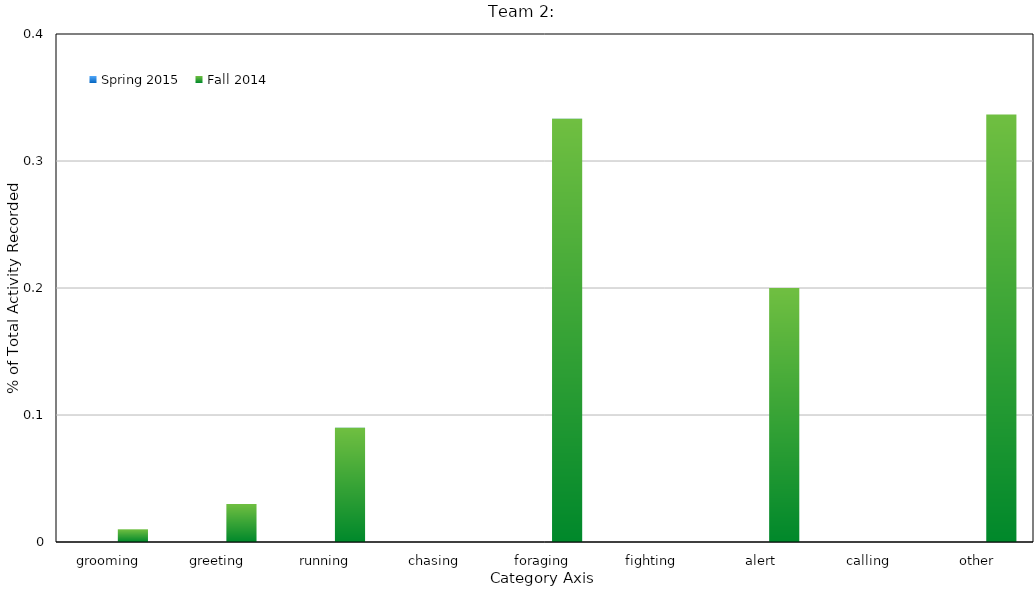
| Category | Spring 2015 | Fall 2014 |
|---|---|---|
| grooming |  | 0.01 |
| greeting |  | 0.03 |
| running |  | 0.09 |
| chasing |  | 0 |
| foraging |  | 0.333 |
| fighting |  | 0 |
| alert |  | 0.2 |
| calling |  | 0 |
| other |  | 0.337 |